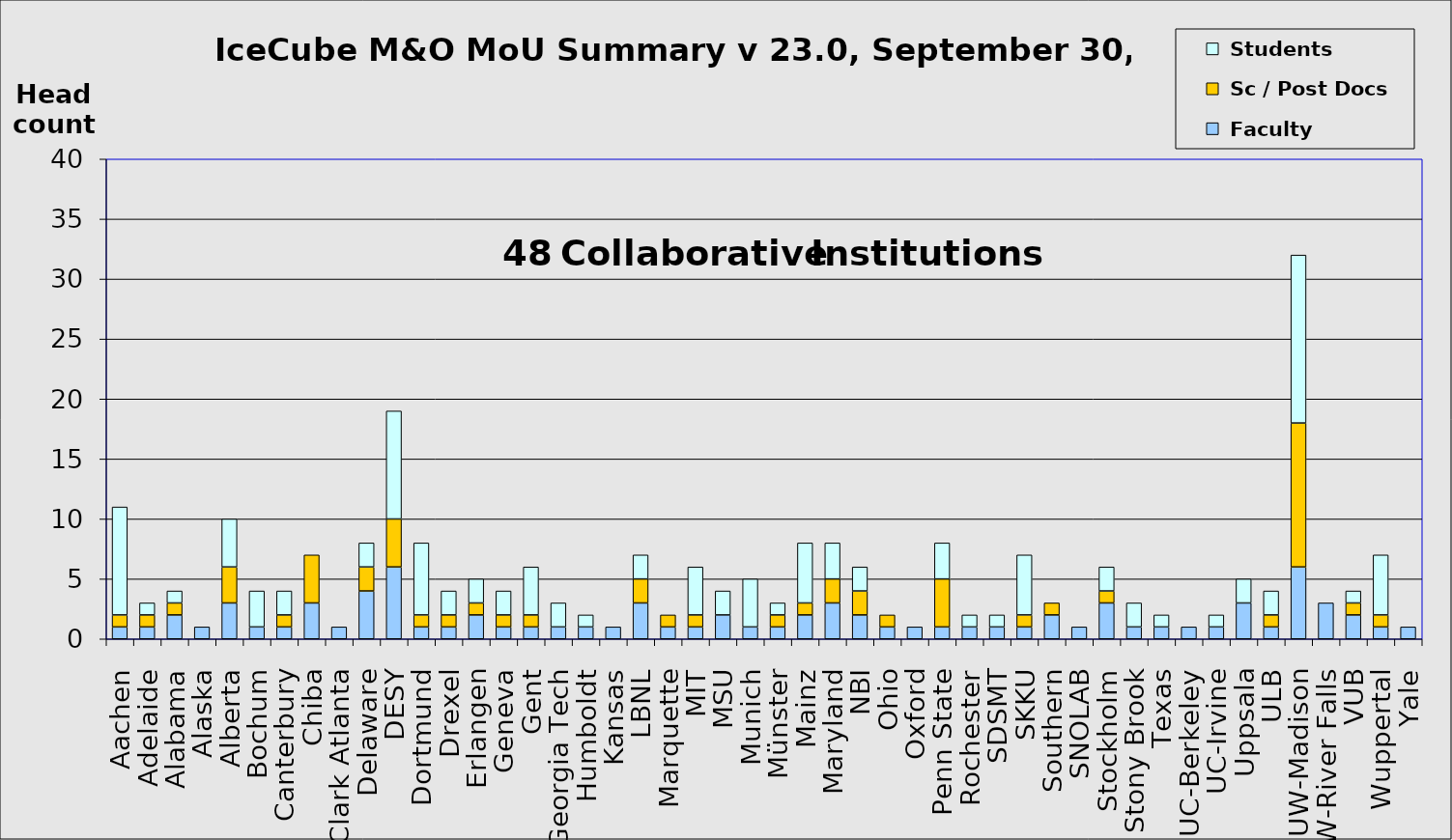
| Category |  Faculty |  Sc / Post Docs |  Students |
|---|---|---|---|
| Aachen | 1 | 1 | 9 |
| Adelaide | 1 | 1 | 1 |
| Alabama | 2 | 1 | 1 |
| Alaska | 1 | 0 | 0 |
| Alberta | 3 | 3 | 4 |
| Bochum | 1 | 0 | 3 |
| Canterbury | 1 | 1 | 2 |
| Chiba | 3 | 4 | 0 |
| Clark Atlanta | 1 | 0 | 0 |
| Delaware | 4 | 2 | 2 |
| DESY | 6 | 4 | 9 |
| Dortmund | 1 | 1 | 6 |
| Drexel | 1 | 1 | 2 |
| Erlangen | 2 | 1 | 2 |
| Geneva | 1 | 1 | 2 |
| Gent | 1 | 1 | 4 |
| Georgia Tech | 1 | 0 | 2 |
| Humboldt | 1 | 0 | 1 |
| Kansas | 1 | 0 | 0 |
| LBNL | 3 | 2 | 2 |
| Marquette | 1 | 1 | 0 |
| MIT | 1 | 1 | 4 |
| MSU | 2 | 0 | 2 |
| Munich | 1 | 0 | 4 |
| Münster | 1 | 1 | 1 |
| Mainz | 2 | 1 | 5 |
| Maryland | 3 | 2 | 3 |
| NBI | 2 | 2 | 2 |
| Ohio | 1 | 1 | 0 |
| Oxford | 1 | 0 | 0 |
| Penn State | 1 | 4 | 3 |
| Rochester | 1 | 0 | 1 |
| SDSMT | 1 | 0 | 1 |
| SKKU | 1 | 1 | 5 |
| Southern | 2 | 1 | 0 |
| SNOLAB | 1 | 0 | 0 |
| Stockholm | 3 | 1 | 2 |
| Stony Brook | 1 | 0 | 2 |
| Texas | 1 | 0 | 1 |
| UC-Berkeley | 1 | 0 | 0 |
| UC-Irvine | 1 | 0 | 1 |
| Uppsala | 3 | 0 | 2 |
| ULB | 1 | 1 | 2 |
| UW-Madison | 6 | 12 | 14 |
| UW-River Falls | 3 | 0 | 0 |
| VUB | 2 | 1 | 1 |
| Wuppertal | 1 | 1 | 5 |
| Yale | 1 | 0 | 0 |